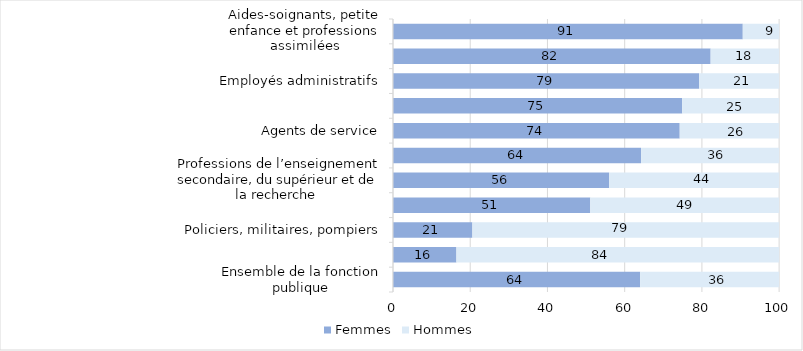
| Category | Femmes | Hommes |
|---|---|---|
| Ensemble de la fonction publique | 64 | 36 |
| Ouvriers | 16.425 | 83.575 |
| Policiers, militaires, pompiers | 20.557 | 79.443 |
| Cadres administratifs et techniques | 51.08 | 48.92 |
| Professions de l’enseignement secondaire, du supérieur et de la recherche  | 55.969 | 44.031 |
| Professions intermédiaires de l'administration et la sécurité | 64.256 | 35.744 |
| Agents de service | 74.252 | 25.748 |
| Professions de l’enseignement primaire et professionnel, formation continue et sport | 74.882 | 25.118 |
| Employés administratifs | 79.276 | 20.724 |
| Professions intermédiaires de la santé et du travail social | 82.257 | 17.743 |
| Aides-soignants, petite enfance et professions assimilées | 90.581 | 9.419 |